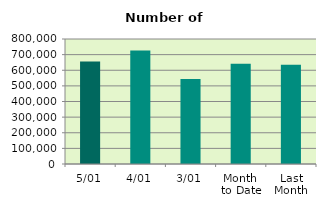
| Category | Series 0 |
|---|---|
| 5/01 | 655514 |
| 4/01 | 726924 |
| 3/01 | 543962 |
| Month 
to Date | 642133.333 |
| Last
Month | 635205.478 |